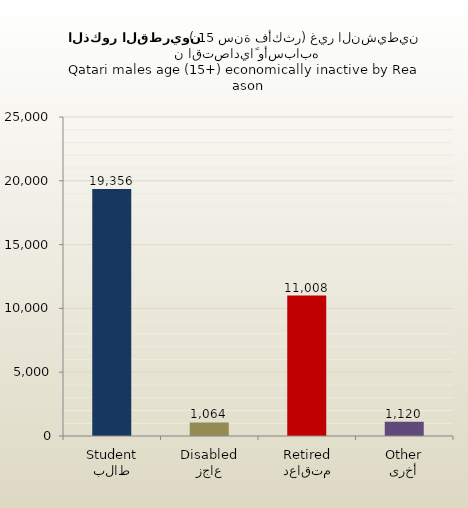
| Category | الذكور القطريين |
|---|---|
| طالب
Student | 19356 |
| عاجز
Disabled | 1064 |
| متقاعد
Retired | 11008 |
| أخرى
Other | 1120 |